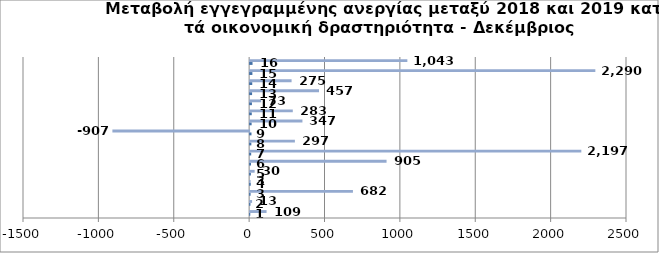
| Category | Series 0 | Series 1 |
|---|---|---|
| 0 | 1 | 109 |
| 1 | 2 | 13 |
| 2 | 3 | 682 |
| 3 | 4 | 3 |
| 4 | 5 | 30 |
| 5 | 6 | 905 |
| 6 | 7 | 2197 |
| 7 | 8 | 297 |
| 8 | 9 | -907 |
| 9 | 10 | 347 |
| 10 | 11 | 283 |
| 11 | 12 | 73 |
| 12 | 13 | 457 |
| 13 | 14 | 275 |
| 14 | 15 | 2290 |
| 15 | 16 | 1043 |